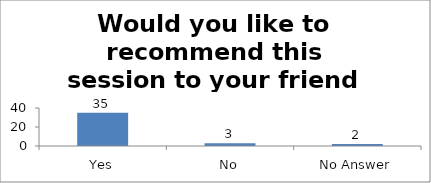
| Category | Would you like to recommend this session to your friend or colleague? |
|---|---|
| Yes | 35 |
| No | 3 |
| No Answer | 2 |